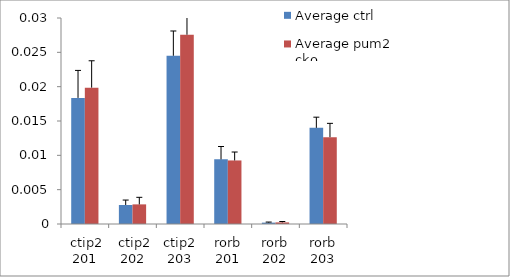
| Category | Average ctrl | Average pum2 cko |
|---|---|---|
|  ctip2 201 | 0.018 | 0.02 |
|  ctip2 202 | 0.003 | 0.003 |
| ctip2 203 | 0.025 | 0.028 |
| rorb 201 | 0.009 | 0.009 |
| rorb 202 | 0 | 0 |
| rorb 203 | 0.014 | 0.013 |